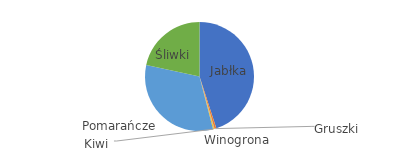
| Category | Kwota |
|---|---|
| Jabłka | 2500 |
| Gruszki | 30 |
| Winogrona | 10 |
| Kiwi | 15 |
| Pomarańcze | 1800 |
| Śliwki | 1200 |